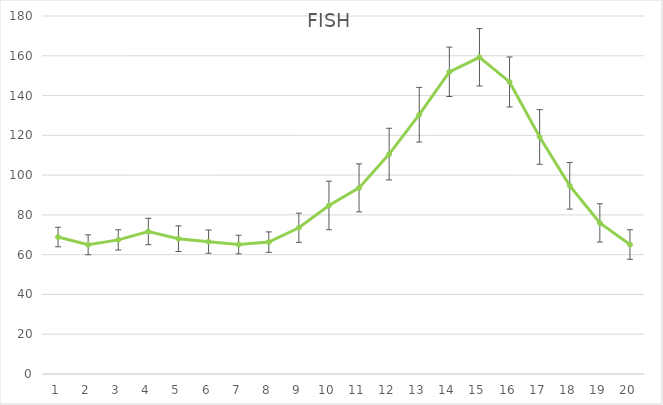
| Category | FISH |
|---|---|
| 0 | 68.865 |
| 1 | 64.957 |
| 2 | 67.423 |
| 3 | 71.639 |
| 4 | 68.038 |
| 5 | 66.549 |
| 6 | 65.093 |
| 7 | 66.314 |
| 8 | 73.514 |
| 9 | 84.734 |
| 10 | 93.575 |
| 11 | 110.557 |
| 12 | 130.361 |
| 13 | 151.928 |
| 14 | 159.247 |
| 15 | 146.841 |
| 16 | 119.193 |
| 17 | 94.622 |
| 18 | 75.973 |
| 19 | 65.102 |